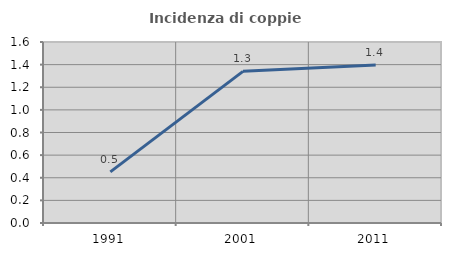
| Category | Incidenza di coppie miste |
|---|---|
| 1991.0 | 0.452 |
| 2001.0 | 1.34 |
| 2011.0 | 1.397 |